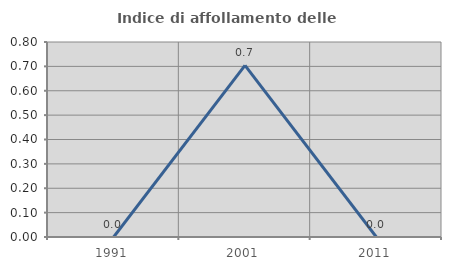
| Category | Indice di affollamento delle abitazioni  |
|---|---|
| 1991.0 | 0 |
| 2001.0 | 0.704 |
| 2011.0 | 0 |